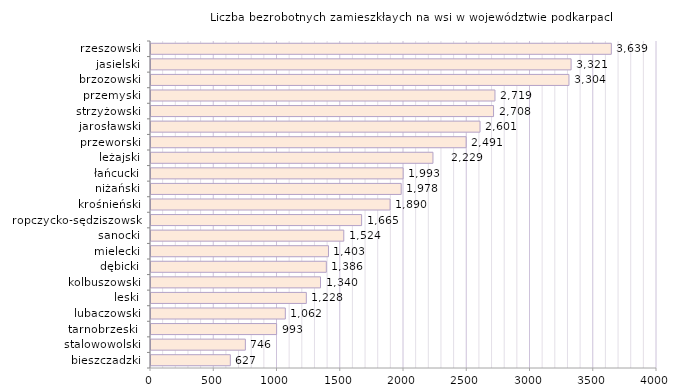
| Category | Liczba bezrobotnych zamieszkłaych na wsi w województwie podkarpackim |
|---|---|
| bieszczadzki | 627 |
| stalowowolski | 746 |
| tarnobrzeski  | 993 |
| lubaczowski | 1062 |
| leski | 1228 |
| kolbuszowski | 1340 |
| dębicki | 1386 |
| mielecki | 1403 |
| sanocki | 1524 |
| ropczycko-sędziszowski | 1665 |
| krośnieński | 1890 |
| niżański | 1978 |
| łańcucki | 1993 |
| leżajski | 2229 |
| przeworski | 2491 |
| jarosławski | 2601 |
| strzyżowski | 2708 |
| przemyski | 2719 |
| brzozowski | 3304 |
| jasielski | 3321 |
| rzeszowski | 3639 |